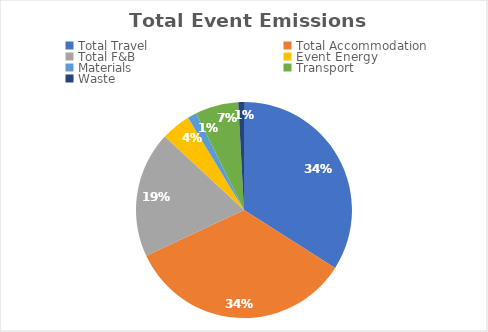
| Category | Series 0 |
|---|---|
| Total Travel | 2 |
| Total Accommodation | 2 |
| Total F&B | 1.11 |
| Event Energy | 0.26 |
| Materials | 0.08 |
| Transport | 0.38 |
| Waste | 0.05 |